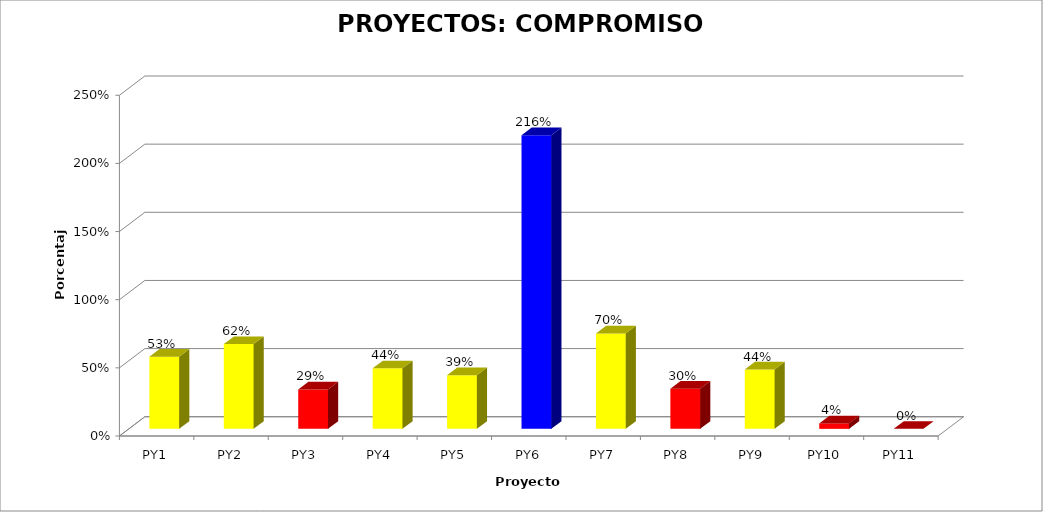
| Category | Series 0 |
|---|---|
| PY1 | 0.53 |
| PY2 | 0.622 |
| PY3 | 0.289 |
| PY4 | 0.444 |
| PY5 | 0.394 |
| PY6 | 2.155 |
| PY7 | 0.7 |
| PY8 | 0.295 |
| PY9 | 0.435 |
| PY10 | 0.04 |
| PY11 | 0 |